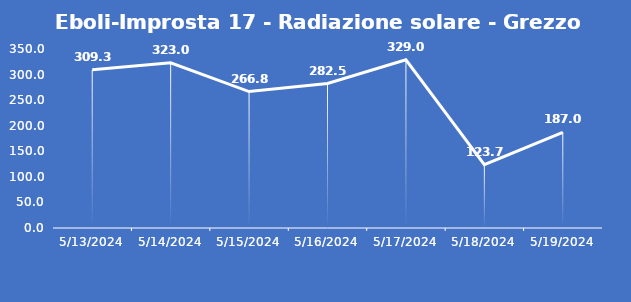
| Category | Eboli-Improsta 17 - Radiazione solare - Grezzo (W/m2) |
|---|---|
| 5/13/24 | 309.3 |
| 5/14/24 | 323 |
| 5/15/24 | 266.8 |
| 5/16/24 | 282.5 |
| 5/17/24 | 329 |
| 5/18/24 | 123.7 |
| 5/19/24 | 187 |